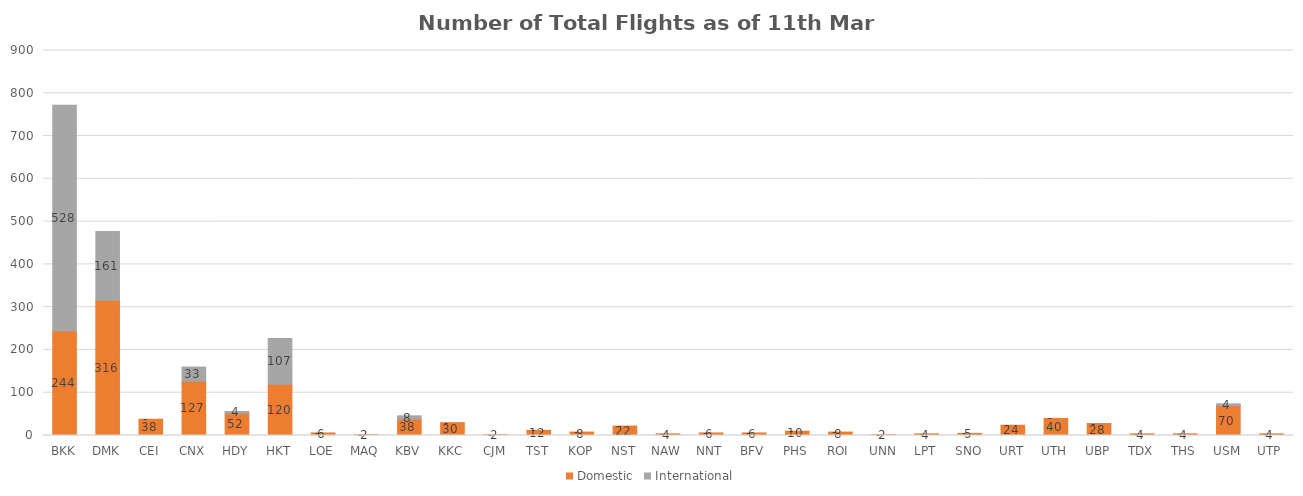
| Category | Domestic | International |
|---|---|---|
| BKK | 244 | 528 |
| DMK | 316 | 161 |
| CEI | 38 | 0 |
| CNX | 127 | 33 |
| HDY | 52 | 4 |
| HKT | 120 | 107 |
| LOE | 6 | 0 |
| MAQ | 2 | 0 |
| KBV | 38 | 8 |
| KKC | 30 | 0 |
| CJM | 2 | 0 |
| TST | 12 | 0 |
| KOP | 8 | 0 |
| NST | 22 | 0 |
| NAW | 4 | 0 |
| NNT | 6 | 0 |
| BFV | 6 | 0 |
| PHS | 10 | 0 |
| ROI | 8 | 0 |
| UNN | 2 | 0 |
| LPT | 4 | 0 |
| SNO | 5 | 0 |
| URT | 24 | 0 |
| UTH | 40 | 0 |
| UBP | 28 | 0 |
| TDX | 4 | 0 |
| THS | 4 | 0 |
| USM | 70 | 4 |
| UTP | 4 | 0 |